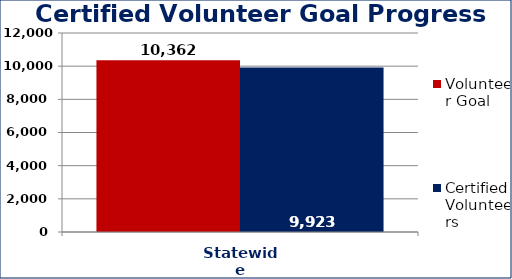
| Category | Volunteer Goal  | Certified Volunteers  |
|---|---|---|
| Statewide | 10362 | 9923 |